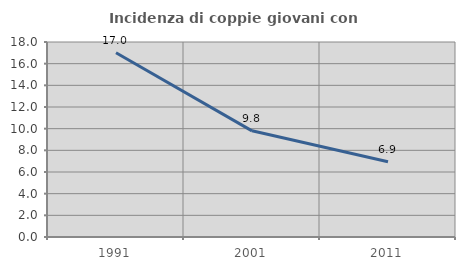
| Category | Incidenza di coppie giovani con figli |
|---|---|
| 1991.0 | 17.009 |
| 2001.0 | 9.8 |
| 2011.0 | 6.941 |